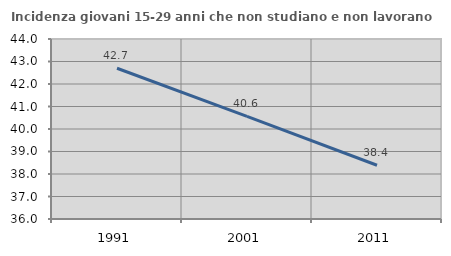
| Category | Incidenza giovani 15-29 anni che non studiano e non lavorano  |
|---|---|
| 1991.0 | 42.701 |
| 2001.0 | 40.562 |
| 2011.0 | 38.389 |